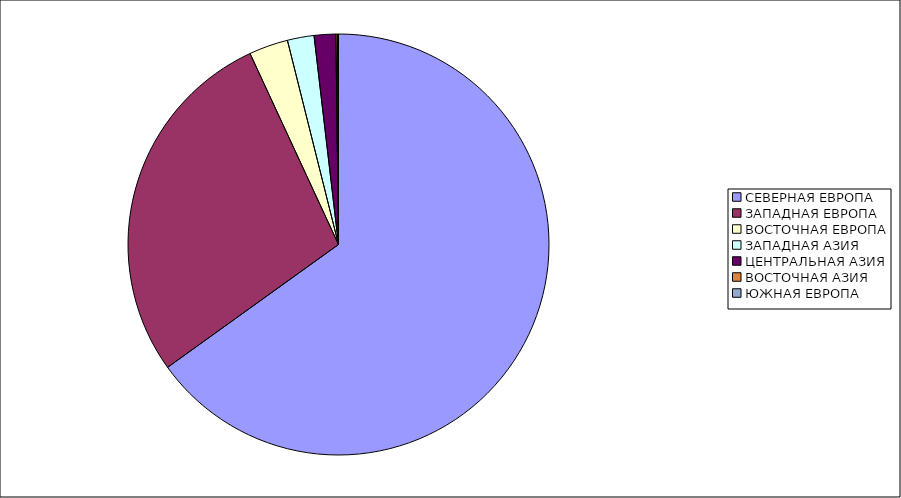
| Category | Оборот |
|---|---|
| СЕВЕРНАЯ ЕВРОПА | 65.08 |
| ЗАПАДНАЯ ЕВРОПА | 28.016 |
| ВОСТОЧНАЯ ЕВРОПА | 3.001 |
| ЗАПАДНАЯ АЗИЯ | 2.045 |
| ЦЕНТРАЛЬНАЯ АЗИЯ | 1.659 |
| ВОСТОЧНАЯ АЗИЯ | 0.124 |
| ЮЖНАЯ ЕВРОПА | 0.074 |